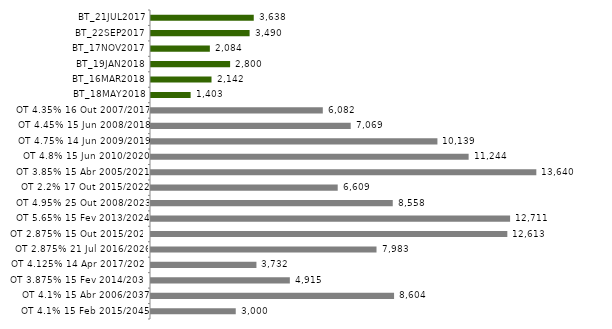
| Category | Series 0 |
|---|---|
| BT_21JUL2017 | 3637.507 |
| BT_22SEP2017 | 3490.471 |
| BT_17NOV2017 | 2083.545 |
| BT_19JAN2018 | 2800.288 |
| BT_16MAR2018 | 2142.007 |
| BT_18MAY2018 | 1403.013 |
| OT 4.35% 16 Out 2007/2017 | 6081.646 |
| OT 4.45% 15 Jun 2008/2018 | 7069.135 |
| OT 4.75% 14 Jun 2009/2019 | 10138.75 |
| OT 4.8% 15 Jun 2010/2020 | 11243.696 |
| OT 3.85% 15 Abr 2005/2021 | 13639.958 |
| OT 2.2% 17 Out 2015/2022 | 6609.343 |
| OT 4.95% 25 Out 2008/2023 | 8557.734 |
| OT 5.65% 15 Fev 2013/2024 | 12711.355 |
| OT 2.875% 15 Out 2015/2025 | 12613.263 |
| OT 2.875% 21 Jul 2016/2026 | 7982.982 |
| OT 4.125% 14 Apr 2017/2027 | 3732.326 |
| OT 3.875% 15 Fev 2014/2030 | 4914.902 |
| OT 4.1% 15 Abr 2006/2037 | 8604.325 |
| OT 4.1% 15 Feb 2015/2045 | 3000 |